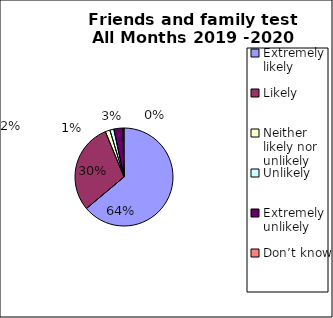
| Category | Series 0 |
|---|---|
| Extremely likely  | 2276 |
| Likely  | 1066 |
| Neither likely nor unlikely | 55 |
| Unlikely  | 47 |
| Extremely unlikely  | 107 |
| Don’t know  | 12 |